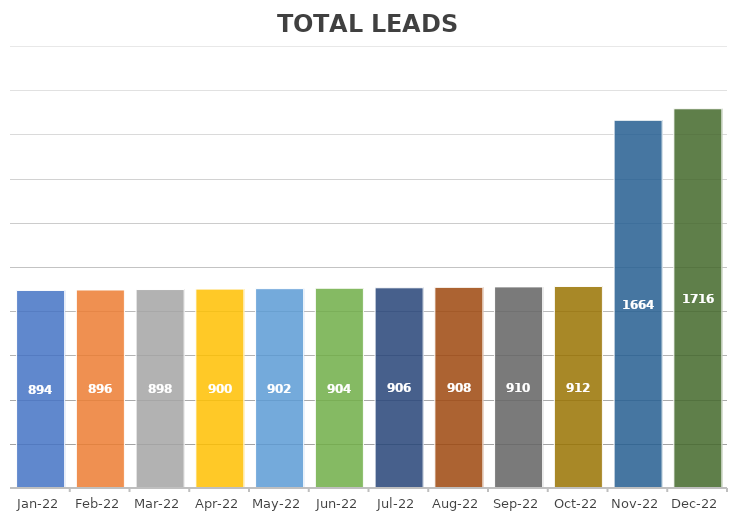
| Category | TOTAL |
|---|---|
| 2022-01-18 | 894 |
| 2022-02-18 | 896 |
| 2022-03-18 | 898 |
| 2022-04-18 | 900 |
| 2022-05-18 | 902 |
| 2022-06-18 | 904 |
| 2022-07-18 | 906 |
| 2022-08-18 | 908 |
| 2022-09-18 | 910 |
| 2022-10-18 | 912 |
| 2022-11-18 | 1664 |
| 2022-12-18 | 1716 |